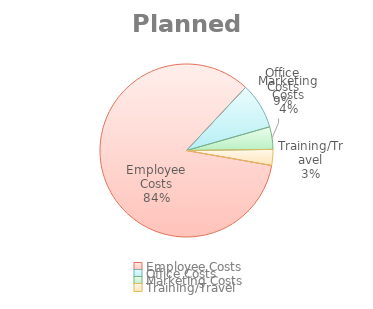
| Category | Series 0 |
|---|---|
| Employee Costs | 1355090 |
| Office Costs | 138740 |
| Marketing Costs | 67800 |
| Training/Travel | 48000 |